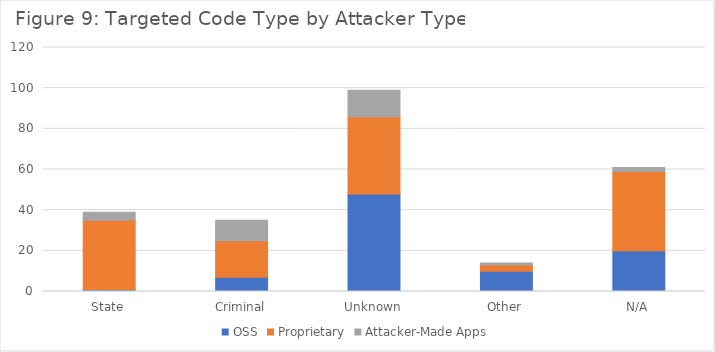
| Category | OSS | Proprietary | Attacker-Made Apps |
|---|---|---|---|
| State | 1 | 34 | 4 |
| Criminal | 7 | 18 | 10 |
| Unknown | 48 | 38 | 13 |
| Other | 10 | 3 | 1 |
| N/A | 20 | 39 | 2 |